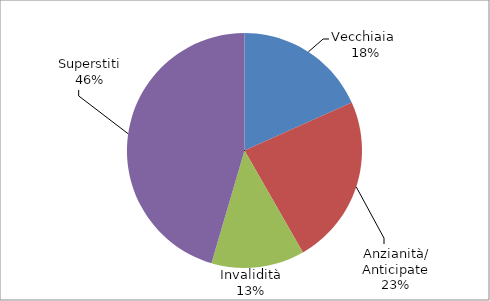
| Category | Series 0 |
|---|---|
| Vecchiaia  | 12304 |
| Anzianità/ Anticipate | 15753 |
| Invalidità | 8622 |
| Superstiti | 30572 |